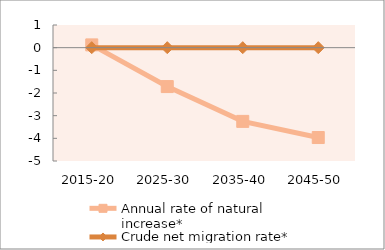
| Category | Annual rate of natural increase* | Crude net migration rate* |
|---|---|---|
| 2015-20 | 0.122 | 0 |
| 2025-30 | -1.716 | 0 |
| 2035-40 | -3.252 | 0 |
| 2045-50 | -3.964 | 0 |